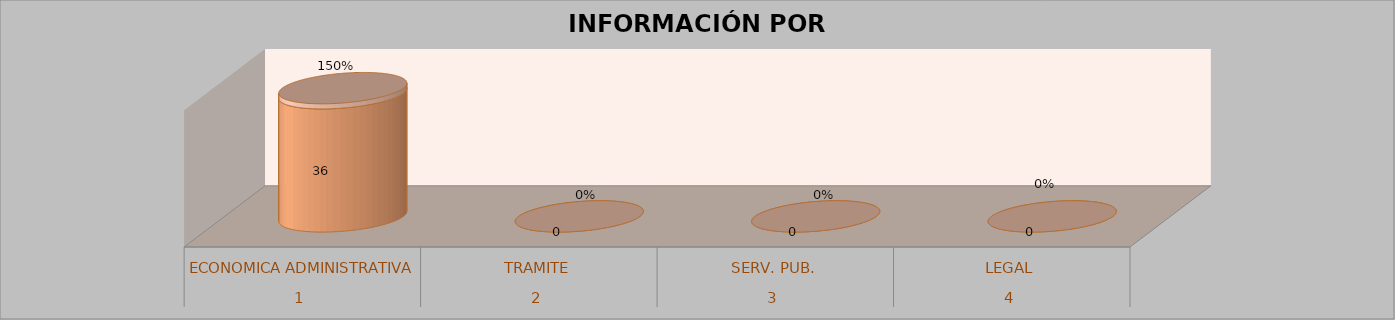
| Category | Series 0 | Series 1 | Series 2 | Series 3 |
|---|---|---|---|---|
| 0 |  |  | 36 | 1.5 |
| 1 |  |  | 0 | 0 |
| 2 |  |  | 0 | 0 |
| 3 |  |  | 0 | 0 |